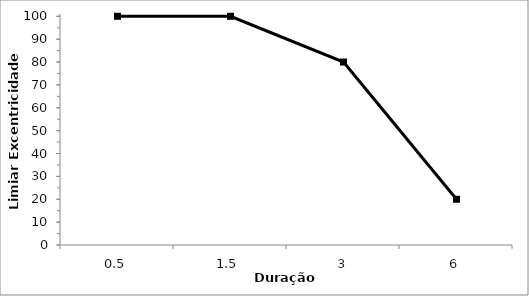
| Category | Series 1 |
|---|---|
| 0.5 | 100 |
| 1.5 | 100 |
| 3.0 | 80 |
| 6.0 | 20 |